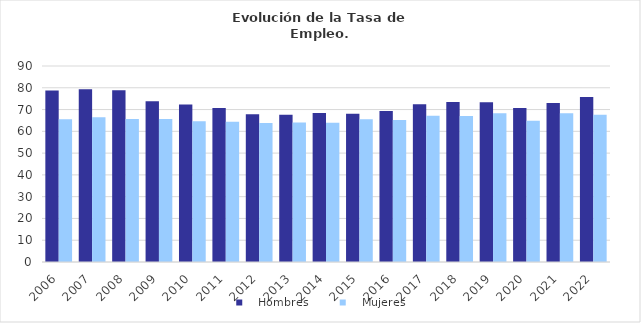
| Category |    Hombres |    Mujeres |
|---|---|---|
| 2006.0 | 78.757 | 65.504 |
| 2007.0 | 79.322 | 66.506 |
| 2008.0 | 78.919 | 65.634 |
| 2009.0 | 73.854 | 65.616 |
| 2010.0 | 72.31 | 64.656 |
| 2011.0 | 70.727 | 64.352 |
| 2012.0 | 67.854 | 63.86 |
| 2013.0 | 67.67 | 64.01 |
| 2014.0 | 68.374 | 63.964 |
| 2015.0 | 68.09 | 65.546 |
| 2016.0 | 69.367 | 65.191 |
| 2017.0 | 72.493 | 67.119 |
| 2018.0 | 73.417 | 67.063 |
| 2019.0 | 73.41 | 68.315 |
| 2020.0 | 70.684 | 64.87 |
| 2021.0 | 73.034 | 68.323 |
| 2022.0 | 75.794 | 67.646 |